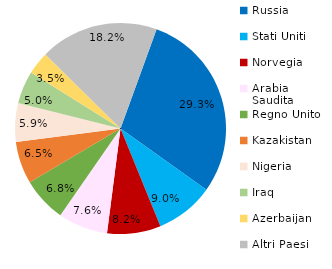
| Category | Series 0 |
|---|---|
| Russia | 170562.572 |
| Stati Uniti | 52128.06 |
| Norvegia | 47813.416 |
| Arabia Saudita | 44293.009 |
| Regno Unito | 39725.97 |
| Kazakistan | 37631.06 |
| Nigeria | 34601.898 |
| Iraq | 29117.416 |
| Azerbaijan | 20331.172 |
| Altri Paesi | 105654.7 |